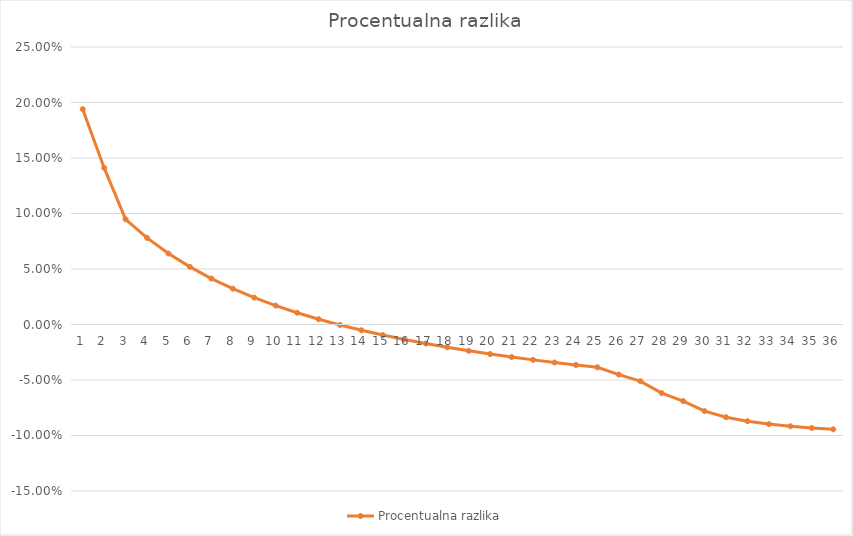
| Category | Procentualna razlika |
|---|---|
| 0 | 0.194 |
| 1 | 0.141 |
| 2 | 0.095 |
| 3 | 0.078 |
| 4 | 0.064 |
| 5 | 0.052 |
| 6 | 0.041 |
| 7 | 0.032 |
| 8 | 0.024 |
| 9 | 0.017 |
| 10 | 0.011 |
| 11 | 0.005 |
| 12 | 0 |
| 13 | -0.005 |
| 14 | -0.01 |
| 15 | -0.014 |
| 16 | -0.017 |
| 17 | -0.021 |
| 18 | -0.024 |
| 19 | -0.027 |
| 20 | -0.029 |
| 21 | -0.032 |
| 22 | -0.034 |
| 23 | -0.036 |
| 24 | -0.039 |
| 25 | -0.045 |
| 26 | -0.051 |
| 27 | -0.062 |
| 28 | -0.069 |
| 29 | -0.078 |
| 30 | -0.083 |
| 31 | -0.087 |
| 32 | -0.09 |
| 33 | -0.092 |
| 34 | -0.093 |
| 35 | -0.094 |